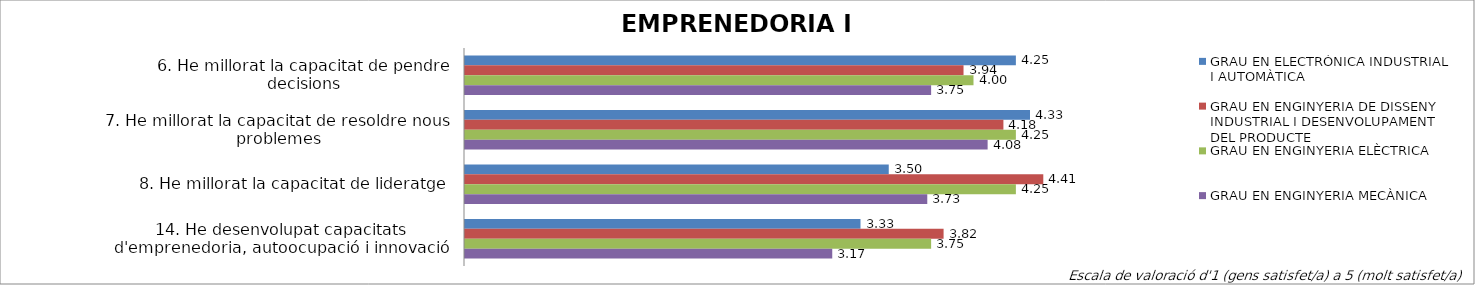
| Category | GRAU EN ELECTRÒNICA INDUSTRIAL I AUTOMÀTICA | GRAU EN ENGINYERIA DE DISSENY INDUSTRIAL I DESENVOLUPAMENT DEL PRODUCTE | GRAU EN ENGINYERIA ELÈCTRICA | GRAU EN ENGINYERIA MECÀNICA |
|---|---|---|---|---|
| 6. He millorat la capacitat de pendre decisions | 4.25 | 3.941 | 4 | 3.75 |
| 7. He millorat la capacitat de resoldre nous problemes | 4.333 | 4.176 | 4.25 | 4.083 |
| 8. He millorat la capacitat de lideratge | 3.5 | 4.412 | 4.25 | 3.727 |
| 14. He desenvolupat capacitats d'emprenedoria, autoocupació i innovació | 3.333 | 3.824 | 3.75 | 3.167 |